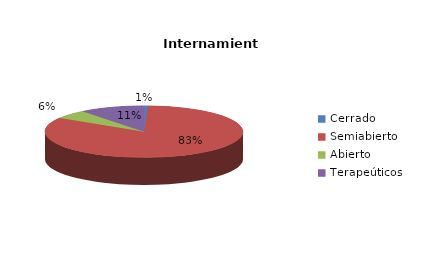
| Category | Series 0 |
|---|---|
| Cerrado | 1 |
| Semiabierto | 134 |
| Abierto | 9 |
| Terapeúticos | 17 |